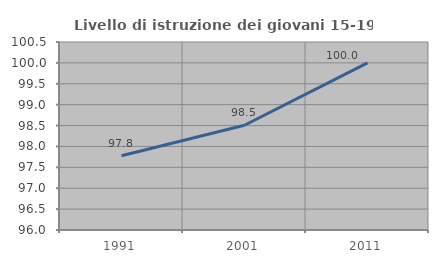
| Category | Livello di istruzione dei giovani 15-19 anni |
|---|---|
| 1991.0 | 97.778 |
| 2001.0 | 98.507 |
| 2011.0 | 100 |